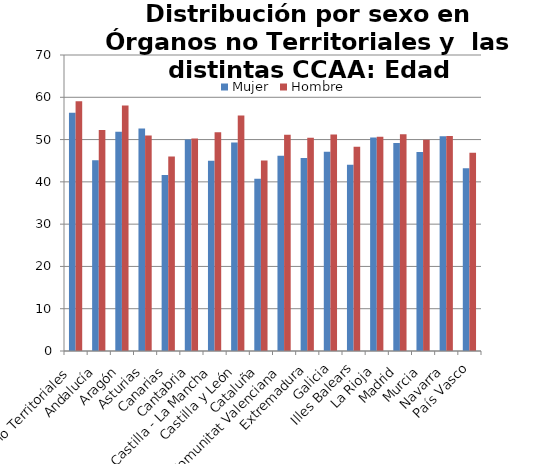
| Category | Mujer | Hombre |
|---|---|---|
| Órganos no Territoriales | 56.354 | 59.08 |
| Andalucía | 45.127 | 52.24 |
| Aragón | 51.846 | 58.045 |
| Asturias | 52.607 | 50.955 |
| Canarias | 41.612 | 46.018 |
| Cantabria | 50 | 50.25 |
| Castilla - La Mancha | 44.967 | 51.714 |
| Castilla y León | 49.282 | 55.705 |
| Cataluña | 40.733 | 45.038 |
| Comunitat Valenciana | 46.19 | 51.144 |
| Extremadura | 45.633 | 50.44 |
| Galicia | 47.12 | 51.17 |
| Illes Balears | 44.023 | 48.286 |
| La Rioja | 50.5 | 50.667 |
| Madrid | 49.163 | 51.279 |
| Murcia | 47.048 | 49.957 |
| Navarra | 50.8 | 50.833 |
| País Vasco | 43.192 | 46.9 |